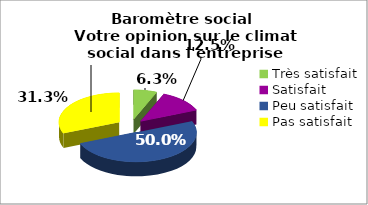
| Category | Series 0 |
|---|---|
| Très satisfait | 0.062 |
| Satisfait | 0.125 |
| Peu satisfait | 0.5 |
| Pas satisfait | 0.312 |